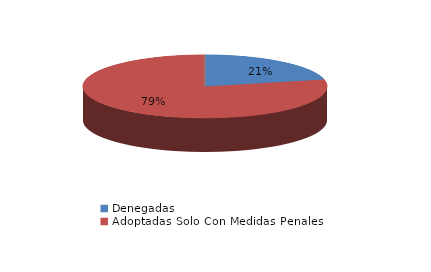
| Category | Series 0 |
|---|---|
| Denegadas | 6 |
| Adoptadas Solo Con Medidas Penales | 22 |
| Adoptadas Con Medidas Civiles Y Penales | 0 |
| Adoptadas Con Medidas Solo Civiles | 0 |